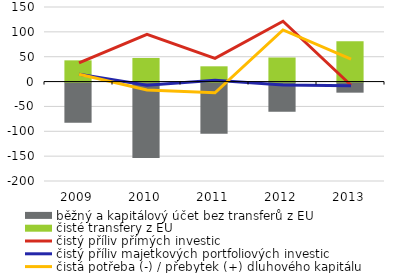
| Category | běžný a kapitálový účet bez transferů z EU | čisté transfery z EU |
|---|---|---|
| 2009.0 | -80.6 | 42.7 |
| 2010.0 | -151.7 | 47.5 |
| 2011.0 | -102.8 | 30.7 |
| 2012.0 | -58.7 | 48.4 |
| 2013.0 | -20.3 | 80.9 |